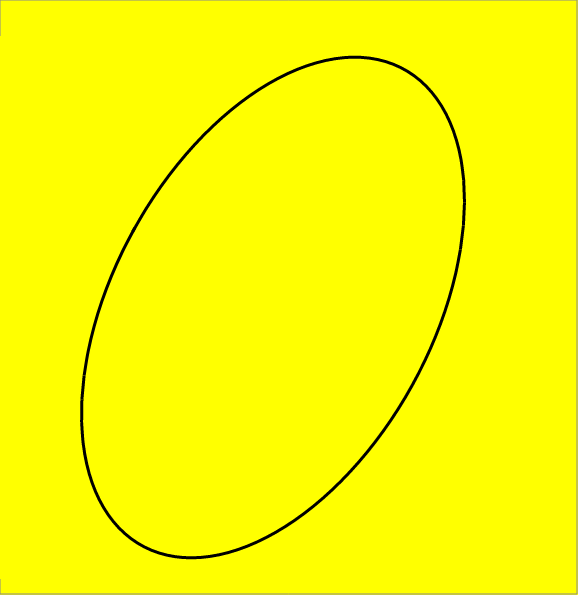
| Category | Series 0 |
|---|---|
| -5.13923773151656 | 2.793 |
| -4.636882563557103 | 3.656 |
| -4.0881971977721765 | 4.483 |
| -3.498663916965432 | 5.265 |
| -2.8741731428049 | 5.994 |
| -2.2209645806767866 | 6.663 |
| -1.5455648746118338 | 7.266 |
| -0.8547223952155822 | 7.796 |
| -0.15533981217999626 | 8.249 |
| 0.5455948749103778 | 8.619 |
| 1.241078158360334 | 8.902 |
| 1.9241609990978499 | 9.097 |
| 2.588018259175443 | 9.201 |
| 3.226016896292453 | 9.213 |
| 3.8317822389611154 | 9.133 |
| 4.399261680116886 | 8.962 |
| 4.922785152767498 | 8.701 |
| 5.397121783428081 | 8.353 |
| 5.817532157279915 | 7.922 |
| 6.1798156728366695 | 7.412 |
| 6.480352512965908 | 6.827 |
| 6.716139812905329 | 6.175 |
| 6.88482166389486 | 5.46 |
| 6.984712652638216 | 4.691 |
| 7.014814701395446 | 3.876 |
| 6.974827040445785 | 3.021 |
| 6.865149213279275 | 2.136 |
| 6.686877084490295 | 1.23 |
| 6.441791890260774 | 0.312 |
| 6.13234244083706 | -0.61 |
| 5.761620652827405 | -1.525 |
| 5.333330655793273 | -2.425 |
| 4.851751781811177 | -3.301 |
| 4.321695807801136 | -4.144 |
| 3.7484588778422463 | -4.945 |
| 3.1377685858517257 | -5.697 |
| 2.4957267473597673 | -6.393 |
| 1.8287484321857694 | -7.024 |
| 1.1434978671812321 | -7.585 |
| 0.4468218494779608 | -8.07 |
| -0.2543186644456257 | -8.475 |
| -0.952918110340645 | -8.795 |
| -1.6419963134699889 | -9.027 |
| -2.3146682322069583 | -9.169 |
| -2.9642127510953067 | -9.22 |
| -3.584139836013175 | -9.178 |
| -4.168255380448713 | -9.044 |
| -4.710723094964846 | -8.82 |
| -5.206122821474119 | -8.508 |
| -5.649504689666625 | -8.111 |
| -6.036438574477946 | -7.633 |
| -6.363058360434383 | -7.079 |
| -6.62610057060081 | -6.454 |
| -6.822936974163435 | -5.764 |
| -6.951600846843325 | -5.017 |
| -7.010806621755285 | -4.22 |
| -6.999962734367221 | -3.381 |
| -6.919177533217404 | -2.507 |
| -6.769258197331682 | -1.609 |
| -6.551702671157487 | -0.695 |
| -6.268684697598051 | 0.226 |
| -5.923032098691878 | 1.145 |
| -5.518198520949679 | 2.053 |
| -5.058228927660067 | 2.94 |